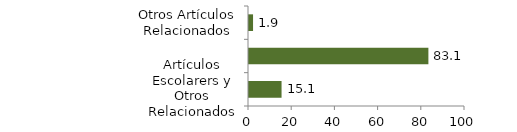
| Category | Educación |
|---|---|
| Artículos Escolarers y Otros Relacionados | 15.073 |
| Instrucción y Enseñanza | 83.053 |
| Otros Artículos Relacionados | 1.874 |